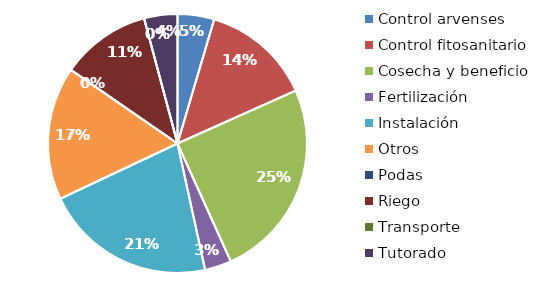
| Category | Valor |
|---|---|
| Control arvenses | 330000 |
| Control fitosanitario | 990000 |
| Cosecha y beneficio | 1800000 |
| Fertilización | 240000 |
| Instalación | 1545000 |
| Otros | 1200000 |
| Podas | 0 |
| Riego | 810000 |
| Transporte | 0 |
| Tutorado | 300000 |